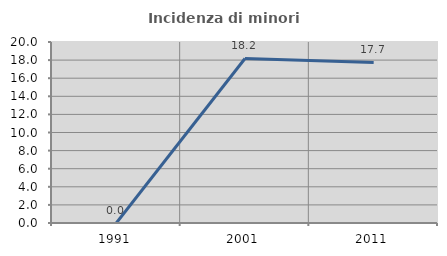
| Category | Incidenza di minori stranieri |
|---|---|
| 1991.0 | 0 |
| 2001.0 | 18.182 |
| 2011.0 | 17.742 |